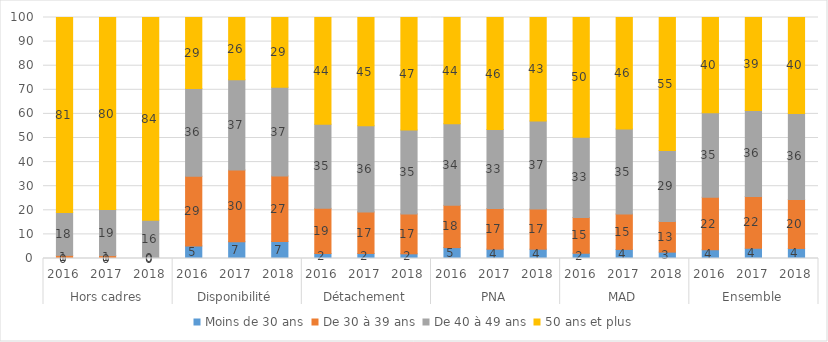
| Category | Moins de 30 ans | De 30 à 39 ans | De 40 à 49 ans | 50 ans et plus |
|---|---|---|---|---|
| 0 | 0 | 1.297 | 17.828 | 80.875 |
| 1 | 0 | 1.207 | 19.115 | 79.678 |
| 2 | 0 | 0.273 | 15.574 | 84.153 |
| 3 | 5.228 | 28.916 | 36.379 | 29.477 |
| 4 | 6.993 | 29.772 | 37.382 | 25.852 |
| 5 | 7.015 | 27.211 | 36.825 | 28.948 |
| 6 | 2.065 | 18.736 | 34.95 | 44.249 |
| 7 | 2.087 | 17.258 | 35.78 | 44.875 |
| 8 | 1.942 | 16.569 | 34.859 | 46.63 |
| 9 | 4.518 | 17.543 | 33.811 | 44.128 |
| 10 | 3.877 | 16.847 | 32.782 | 46.494 |
| 11 | 3.858 | 16.662 | 36.538 | 42.942 |
| 12 | 2.178 | 14.847 | 33.333 | 49.642 |
| 13 | 3.768 | 14.7 | 35.238 | 46.294 |
| 14 | 2.643 | 12.73 | 29.391 | 55.235 |
| 15 | 3.608 | 21.809 | 35.077 | 39.505 |
| 16 | 4.225 | 21.508 | 35.694 | 38.573 |
| 17 | 4.172 | 20.316 | 35.68 | 39.831 |